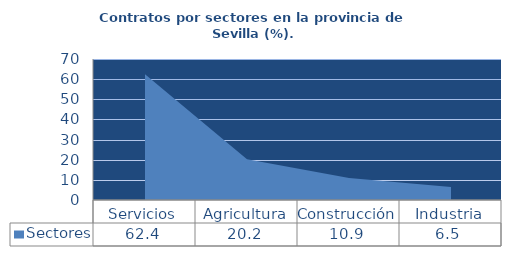
| Category | Sectores |
|---|---|
| Servicios | 62.4 |
| Agricultura | 20.2 |
| Construcción | 10.9 |
| Industria | 6.5 |